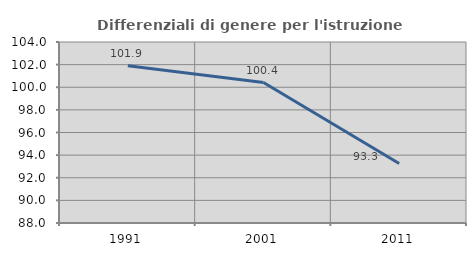
| Category | Differenziali di genere per l'istruzione superiore |
|---|---|
| 1991.0 | 101.901 |
| 2001.0 | 100.418 |
| 2011.0 | 93.256 |